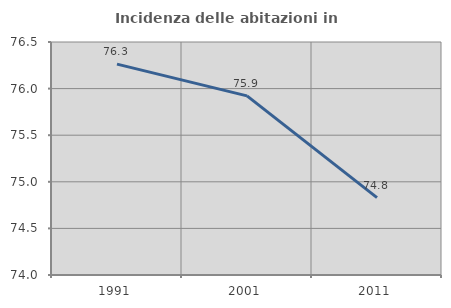
| Category | Incidenza delle abitazioni in proprietà  |
|---|---|
| 1991.0 | 76.263 |
| 2001.0 | 75.922 |
| 2011.0 | 74.83 |